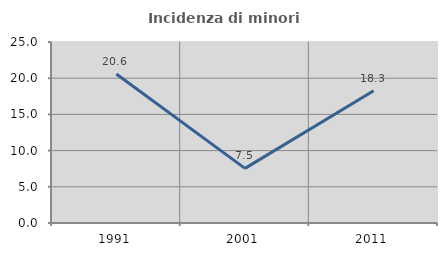
| Category | Incidenza di minori stranieri |
|---|---|
| 1991.0 | 20.588 |
| 2001.0 | 7.547 |
| 2011.0 | 18.263 |